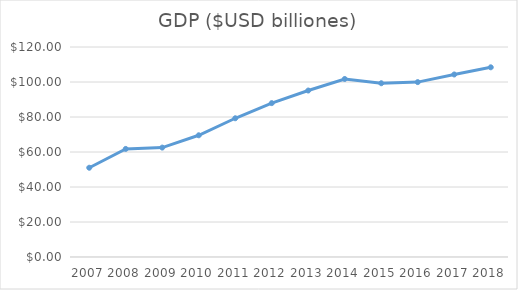
| Category | GDP (Billiones de dolares) |
|---|---|
| 2007.0 | 51.008 |
| 2008.0 | 61.763 |
| 2009.0 | 62.52 |
| 2010.0 | 69.555 |
| 2011.0 | 79.277 |
| 2012.0 | 87.925 |
| 2013.0 | 95.13 |
| 2014.0 | 101.726 |
| 2015.0 | 99.29 |
| 2016.0 | 99.938 |
| 2017.0 | 104.296 |
| 2018.0 | 108.398 |